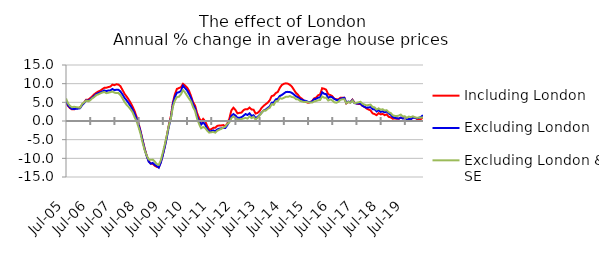
| Category | Including London | Excluding London | Excluding London & SE |
|---|---|---|---|
| 2005-07-01 | 5.042 | 5.34 | 6.041 |
| 2005-08-01 | 4.021 | 4.233 | 4.729 |
| 2005-09-01 | 3.44 | 3.609 | 4.031 |
| 2005-10-01 | 3.117 | 3.198 | 3.683 |
| 2005-11-01 | 3.119 | 3.179 | 3.804 |
| 2005-12-01 | 3.391 | 3.293 | 3.72 |
| 2006-01-01 | 3.46 | 3.314 | 3.632 |
| 2006-02-01 | 3.679 | 3.428 | 3.573 |
| 2006-03-01 | 4.36 | 4.288 | 4.578 |
| 2006-04-01 | 4.971 | 4.807 | 4.982 |
| 2006-05-01 | 5.703 | 5.549 | 5.472 |
| 2006-06-01 | 5.682 | 5.378 | 5.289 |
| 2006-07-01 | 6.13 | 5.818 | 5.553 |
| 2006-08-01 | 6.584 | 6.212 | 6.08 |
| 2006-09-01 | 7.141 | 6.725 | 6.422 |
| 2006-10-01 | 7.569 | 7.227 | 6.924 |
| 2006-11-01 | 7.9 | 7.477 | 7.14 |
| 2006-12-01 | 8.141 | 7.684 | 7.41 |
| 2007-01-01 | 8.527 | 7.906 | 7.62 |
| 2007-02-01 | 8.881 | 8.173 | 7.77 |
| 2007-03-01 | 8.911 | 8.019 | 7.457 |
| 2007-04-01 | 9.095 | 8.169 | 7.568 |
| 2007-05-01 | 9.213 | 8.204 | 7.716 |
| 2007-06-01 | 9.739 | 8.578 | 7.871 |
| 2007-07-01 | 9.603 | 8.264 | 7.598 |
| 2007-08-01 | 9.834 | 8.384 | 7.471 |
| 2007-09-01 | 9.759 | 8.353 | 7.476 |
| 2007-10-01 | 9.31 | 7.908 | 6.946 |
| 2007-11-01 | 8.338 | 7.116 | 6.089 |
| 2007-12-01 | 7.301 | 6.209 | 5.13 |
| 2008-01-01 | 6.594 | 5.569 | 4.358 |
| 2008-02-01 | 5.803 | 4.819 | 3.807 |
| 2008-03-01 | 4.897 | 4.031 | 3.135 |
| 2008-04-01 | 3.869 | 3.081 | 2.34 |
| 2008-05-01 | 2.669 | 1.982 | 1.042 |
| 2008-06-01 | 1.104 | 0.608 | -0.088 |
| 2008-07-01 | -0.68 | -0.992 | -1.674 |
| 2008-08-01 | -2.784 | -3 | -3.489 |
| 2008-09-01 | -5.142 | -5.294 | -5.824 |
| 2008-10-01 | -7.4 | -7.555 | -7.844 |
| 2008-11-01 | -9.283 | -9.376 | -9.246 |
| 2008-12-01 | -10.716 | -10.891 | -10.295 |
| 2009-01-01 | -11.416 | -11.431 | -10.399 |
| 2009-02-01 | -11.461 | -11.235 | -10.34 |
| 2009-03-01 | -11.986 | -11.748 | -10.864 |
| 2009-04-01 | -12.284 | -12.069 | -11.542 |
| 2009-05-01 | -12.391 | -12.497 | -11.751 |
| 2009-06-01 | -11.045 | -11.133 | -10.506 |
| 2009-07-01 | -9.035 | -9.204 | -8.454 |
| 2009-08-01 | -6.756 | -6.883 | -6.256 |
| 2009-09-01 | -3.959 | -4.358 | -3.813 |
| 2009-10-01 | -1.05 | -1.44 | -1.209 |
| 2009-11-01 | 1.332 | 0.762 | 0.706 |
| 2009-12-01 | 4.938 | 4.524 | 3.867 |
| 2010-01-01 | 7.185 | 6.538 | 5.474 |
| 2010-02-01 | 8.595 | 7.568 | 6.419 |
| 2010-03-01 | 8.825 | 7.698 | 6.489 |
| 2010-04-01 | 9.037 | 8.044 | 7.15 |
| 2010-05-01 | 9.954 | 9.479 | 8.277 |
| 2010-06-01 | 9.51 | 8.83 | 7.67 |
| 2010-07-01 | 8.98 | 8.233 | 6.814 |
| 2010-08-01 | 8.1 | 7.247 | 5.995 |
| 2010-09-01 | 6.68 | 6.17 | 5.224 |
| 2010-10-01 | 5.06 | 4.477 | 3.72 |
| 2010-11-01 | 4.111 | 3.455 | 2.686 |
| 2010-12-01 | 2.111 | 1.245 | 0.589 |
| 2011-01-01 | 0.812 | 0.009 | -0.813 |
| 2011-02-01 | -0.153 | -0.975 | -1.959 |
| 2011-03-01 | 0.561 | -0.352 | -1.604 |
| 2011-04-01 | -0.049 | -0.993 | -1.861 |
| 2011-05-01 | -1.337 | -2.104 | -2.603 |
| 2011-06-01 | -2.364 | -2.804 | -3.111 |
| 2011-07-01 | -2.193 | -2.71 | -3.015 |
| 2011-08-01 | -1.838 | -2.514 | -2.939 |
| 2011-09-01 | -1.815 | -2.702 | -3.127 |
| 2011-10-01 | -1.313 | -2.26 | -2.601 |
| 2011-11-01 | -1.193 | -2.051 | -2.33 |
| 2011-12-01 | -1.187 | -1.975 | -2.083 |
| 2012-01-01 | -1.1 | -1.808 | -1.74 |
| 2012-02-01 | -1.426 | -1.872 | -1.49 |
| 2012-03-01 | -0.66 | -1.074 | -0.763 |
| 2012-04-01 | 0.645 | -0.139 | -0.379 |
| 2012-05-01 | 2.851 | 1.385 | 0.785 |
| 2012-06-01 | 3.556 | 1.855 | 1.213 |
| 2012-07-01 | 2.98 | 1.48 | 0.842 |
| 2012-08-01 | 2.051 | 0.876 | 0.424 |
| 2012-09-01 | 2.183 | 0.85 | 0.325 |
| 2012-10-01 | 2.249 | 1.007 | 0.526 |
| 2012-11-01 | 2.896 | 1.405 | 0.672 |
| 2012-12-01 | 3.177 | 1.864 | 0.816 |
| 2013-01-01 | 3.149 | 1.614 | 0.648 |
| 2013-02-01 | 3.602 | 2.058 | 1.223 |
| 2013-03-01 | 3.097 | 1.383 | 0.768 |
| 2013-04-01 | 3.012 | 1.539 | 1.119 |
| 2013-05-01 | 1.998 | 0.817 | 0.37 |
| 2013-06-01 | 2.165 | 1.096 | 0.849 |
| 2013-07-01 | 2.664 | 1.622 | 1.488 |
| 2013-08-01 | 3.537 | 2.231 | 2.192 |
| 2013-09-01 | 4.062 | 2.809 | 2.824 |
| 2013-10-01 | 4.504 | 3.05 | 2.769 |
| 2013-11-01 | 4.904 | 3.489 | 3.256 |
| 2013-12-01 | 5.552 | 3.894 | 3.532 |
| 2014-01-01 | 6.672 | 4.881 | 4.507 |
| 2014-02-01 | 6.837 | 4.965 | 4.315 |
| 2014-03-01 | 7.485 | 5.784 | 5.271 |
| 2014-04-01 | 7.762 | 5.942 | 5.327 |
| 2014-05-01 | 8.89 | 6.699 | 6.153 |
| 2014-06-01 | 9.637 | 6.984 | 5.954 |
| 2014-07-01 | 9.951 | 7.361 | 6.199 |
| 2014-08-01 | 10.096 | 7.756 | 6.47 |
| 2014-09-01 | 10.007 | 7.805 | 6.464 |
| 2014-10-01 | 9.695 | 7.747 | 6.671 |
| 2014-11-01 | 9.213 | 7.531 | 6.418 |
| 2014-12-01 | 8.373 | 7.095 | 6.34 |
| 2015-01-01 | 7.547 | 6.647 | 5.856 |
| 2015-02-01 | 7.027 | 6.342 | 5.823 |
| 2015-03-01 | 6.305 | 5.908 | 5.404 |
| 2015-04-01 | 5.966 | 5.669 | 5.238 |
| 2015-05-01 | 5.412 | 5.482 | 5.073 |
| 2015-06-01 | 5.095 | 5.374 | 5.149 |
| 2015-07-01 | 4.873 | 5.112 | 5.019 |
| 2015-08-01 | 5.068 | 5.03 | 4.93 |
| 2015-09-01 | 5.314 | 5.251 | 4.922 |
| 2015-10-01 | 6.053 | 5.827 | 5.238 |
| 2015-11-01 | 6.264 | 5.939 | 5.358 |
| 2015-12-01 | 6.887 | 6.247 | 5.55 |
| 2016-01-01 | 7.107 | 6.314 | 5.615 |
| 2016-02-01 | 8.779 | 7.698 | 6.563 |
| 2016-03-01 | 8.635 | 7.291 | 6.253 |
| 2016-04-01 | 8.371 | 7.184 | 6.224 |
| 2016-05-01 | 7.156 | 6.181 | 5.489 |
| 2016-06-01 | 6.972 | 6.52 | 5.778 |
| 2016-07-01 | 6.659 | 6.355 | 5.535 |
| 2016-08-01 | 5.976 | 5.937 | 5.005 |
| 2016-09-01 | 5.835 | 5.644 | 4.902 |
| 2016-10-01 | 5.753 | 5.566 | 5.12 |
| 2016-11-01 | 6.201 | 5.946 | 5.677 |
| 2016-12-01 | 6.209 | 6.09 | 5.808 |
| 2017-01-01 | 6.212 | 6.218 | 5.846 |
| 2017-02-01 | 4.709 | 4.856 | 4.729 |
| 2017-03-01 | 5.087 | 5.218 | 5.135 |
| 2017-04-01 | 5.037 | 4.991 | 4.884 |
| 2017-05-01 | 5.713 | 5.63 | 5.481 |
| 2017-06-01 | 4.922 | 4.802 | 4.805 |
| 2017-07-01 | 4.694 | 4.681 | 4.875 |
| 2017-08-01 | 4.548 | 4.66 | 4.997 |
| 2017-09-01 | 4.546 | 4.661 | 5.149 |
| 2017-10-01 | 4.045 | 4.097 | 4.617 |
| 2017-11-01 | 3.801 | 3.778 | 4.397 |
| 2017-12-01 | 3.345 | 3.572 | 4.193 |
| 2018-01-01 | 3.076 | 3.616 | 4.283 |
| 2018-02-01 | 2.85 | 3.709 | 4.383 |
| 2018-03-01 | 2.045 | 3.175 | 3.754 |
| 2018-04-01 | 1.853 | 3.127 | 3.645 |
| 2018-05-01 | 1.563 | 2.563 | 3.05 |
| 2018-06-01 | 2.107 | 2.876 | 3.381 |
| 2018-07-01 | 1.779 | 2.45 | 3.027 |
| 2018-08-01 | 1.905 | 2.582 | 3.154 |
| 2018-09-01 | 1.567 | 2.333 | 2.802 |
| 2018-10-01 | 1.769 | 2.521 | 2.902 |
| 2018-11-01 | 1.108 | 2.039 | 2.339 |
| 2018-12-01 | 0.986 | 1.669 | 2.136 |
| 2019-01-01 | 0.617 | 1.069 | 1.542 |
| 2019-02-01 | 0.665 | 0.844 | 1.372 |
| 2019-03-01 | 0.599 | 0.741 | 1.317 |
| 2019-04-01 | 0.62 | 0.654 | 1.443 |
| 2019-05-01 | 0.896 | 0.923 | 1.704 |
| 2019-06-01 | 0.74 | 0.661 | 1.225 |
| 2019-07-01 | 0.763 | 0.805 | 1.252 |
| 2019-08-01 | 0.362 | 0.385 | 0.844 |
| 2019-09-01 | 0.459 | 0.565 | 1.176 |
| 2019-10-01 | 0.439 | 0.497 | 1.026 |
| 2019-11-01 | 0.976 | 0.892 | 1.259 |
| 2019-12-01 | 0.884 | 0.838 | 0.993 |
| 2020-01-01 | 0.542 | 0.726 | 0.858 |
| 2020-02-01 | 0.315 | 0.844 | 0.948 |
| 2020-03-01 | 0.527 | 1.08 | 0.9 |
| 2020-04-01 | 0.928 | 1.552 | 0.926 |